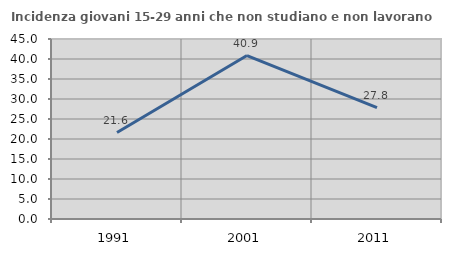
| Category | Incidenza giovani 15-29 anni che non studiano e non lavorano  |
|---|---|
| 1991.0 | 21.622 |
| 2001.0 | 40.856 |
| 2011.0 | 27.83 |